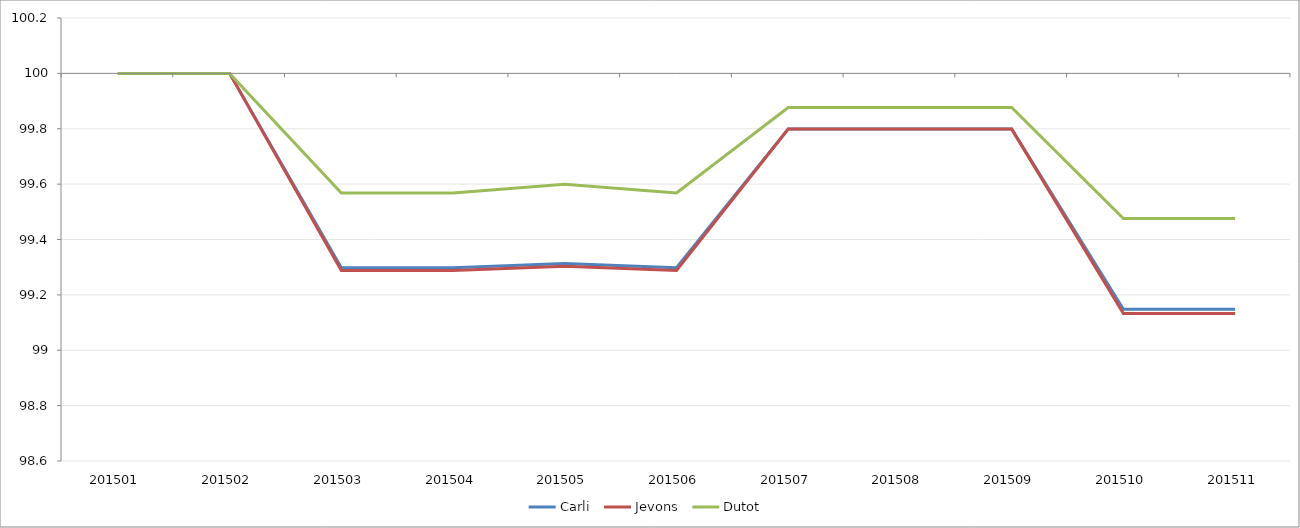
| Category | Carli | Jevons | Dutot |
|---|---|---|---|
| 201501.0 | 100 | 100 | 100 |
| 201502.0 | 100 | 100 | 100 |
| 201503.0 | 99.298 | 99.288 | 99.568 |
| 201504.0 | 99.298 | 99.288 | 99.568 |
| 201505.0 | 99.314 | 99.303 | 99.599 |
| 201506.0 | 99.298 | 99.288 | 99.568 |
| 201507.0 | 99.799 | 99.799 | 99.877 |
| 201508.0 | 99.799 | 99.799 | 99.877 |
| 201509.0 | 99.799 | 99.799 | 99.877 |
| 201510.0 | 99.148 | 99.133 | 99.476 |
| 201511.0 | 99.148 | 99.133 | 99.476 |